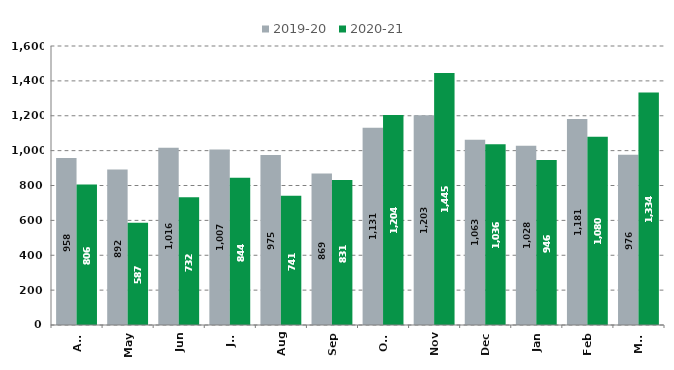
| Category | 2019-20 | 2020-21 |
|---|---|---|
| Apr | 958 | 806 |
| May | 892 | 587 |
| Jun | 1016 | 732 |
| Jul | 1007 | 844 |
| Aug | 975 | 741 |
| Sep | 869 | 831 |
| Oct | 1131 | 1204 |
| Nov | 1203 | 1445 |
| Dec | 1063 | 1036 |
| Jan | 1028 | 946 |
| Feb | 1181 | 1080 |
| Mar | 976 | 1334 |